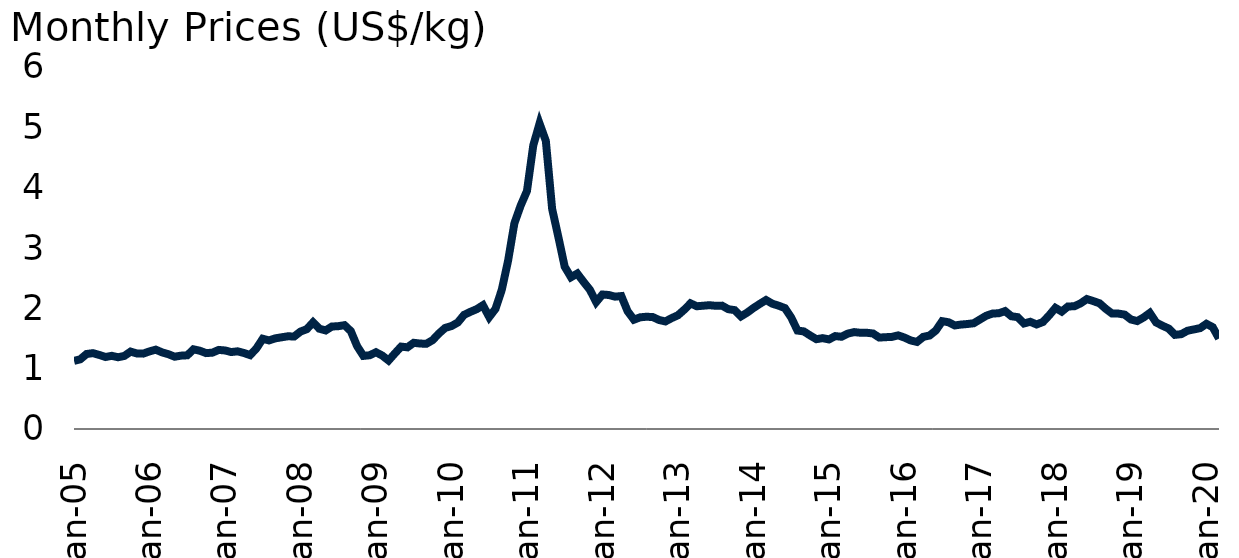
| Category | Cotton |
|---|---|
| 2005-01-01 | 1.13 |
| 2005-02-01 | 1.156 |
| 2005-03-01 | 1.243 |
| 2005-04-01 | 1.257 |
| 2005-05-01 | 1.228 |
| 2005-06-01 | 1.193 |
| 2005-07-01 | 1.213 |
| 2005-08-01 | 1.189 |
| 2005-09-01 | 1.211 |
| 2005-10-01 | 1.283 |
| 2005-11-01 | 1.252 |
| 2005-12-01 | 1.249 |
| 2006-01-01 | 1.286 |
| 2006-02-01 | 1.315 |
| 2006-03-01 | 1.27 |
| 2006-04-01 | 1.24 |
| 2006-05-01 | 1.198 |
| 2006-06-01 | 1.216 |
| 2006-07-01 | 1.221 |
| 2006-08-01 | 1.321 |
| 2006-09-01 | 1.297 |
| 2006-10-01 | 1.258 |
| 2006-11-01 | 1.265 |
| 2006-12-01 | 1.311 |
| 2007-01-01 | 1.302 |
| 2007-02-01 | 1.275 |
| 2007-03-01 | 1.287 |
| 2007-04-01 | 1.26 |
| 2007-05-01 | 1.225 |
| 2007-06-01 | 1.336 |
| 2007-07-01 | 1.496 |
| 2007-08-01 | 1.468 |
| 2007-09-01 | 1.502 |
| 2007-10-01 | 1.52 |
| 2007-11-01 | 1.537 |
| 2007-12-01 | 1.533 |
| 2008-01-01 | 1.615 |
| 2008-02-01 | 1.655 |
| 2008-03-01 | 1.768 |
| 2008-04-01 | 1.662 |
| 2008-05-01 | 1.634 |
| 2008-06-01 | 1.699 |
| 2008-07-01 | 1.704 |
| 2008-08-01 | 1.721 |
| 2008-09-01 | 1.623 |
| 2008-10-01 | 1.373 |
| 2008-11-01 | 1.211 |
| 2008-12-01 | 1.222 |
| 2009-01-01 | 1.272 |
| 2009-02-01 | 1.217 |
| 2009-03-01 | 1.135 |
| 2009-04-01 | 1.252 |
| 2009-05-01 | 1.366 |
| 2009-06-01 | 1.354 |
| 2009-07-01 | 1.429 |
| 2009-08-01 | 1.416 |
| 2009-09-01 | 1.412 |
| 2009-10-01 | 1.473 |
| 2009-11-01 | 1.583 |
| 2009-12-01 | 1.676 |
| 2010-01-01 | 1.706 |
| 2010-02-01 | 1.765 |
| 2010-03-01 | 1.892 |
| 2010-04-01 | 1.942 |
| 2010-05-01 | 1.986 |
| 2010-06-01 | 2.051 |
| 2010-07-01 | 1.855 |
| 2010-08-01 | 1.992 |
| 2010-09-01 | 2.309 |
| 2010-10-01 | 2.79 |
| 2010-11-01 | 3.41 |
| 2010-12-01 | 3.703 |
| 2011-01-01 | 3.945 |
| 2011-02-01 | 4.7 |
| 2011-03-01 | 5.063 |
| 2011-04-01 | 4.776 |
| 2011-05-01 | 3.649 |
| 2011-06-01 | 3.178 |
| 2011-07-01 | 2.69 |
| 2011-08-01 | 2.515 |
| 2011-09-01 | 2.576 |
| 2011-10-01 | 2.439 |
| 2011-11-01 | 2.308 |
| 2011-12-01 | 2.104 |
| 2012-01-01 | 2.229 |
| 2012-02-01 | 2.221 |
| 2012-03-01 | 2.194 |
| 2012-04-01 | 2.203 |
| 2012-05-01 | 1.952 |
| 2012-06-01 | 1.812 |
| 2012-07-01 | 1.851 |
| 2012-08-01 | 1.861 |
| 2012-09-01 | 1.855 |
| 2012-10-01 | 1.807 |
| 2012-11-01 | 1.783 |
| 2012-12-01 | 1.838 |
| 2013-01-01 | 1.885 |
| 2013-02-01 | 1.978 |
| 2013-03-01 | 2.082 |
| 2013-04-01 | 2.034 |
| 2013-05-01 | 2.043 |
| 2013-06-01 | 2.052 |
| 2013-07-01 | 2.042 |
| 2013-08-01 | 2.045 |
| 2013-09-01 | 1.986 |
| 2013-10-01 | 1.97 |
| 2013-11-01 | 1.866 |
| 2013-12-01 | 1.929 |
| 2014-01-01 | 2.005 |
| 2014-02-01 | 2.073 |
| 2014-03-01 | 2.137 |
| 2014-04-01 | 2.077 |
| 2014-05-01 | 2.044 |
| 2014-06-01 | 2.004 |
| 2014-07-01 | 1.848 |
| 2014-08-01 | 1.631 |
| 2014-09-01 | 1.618 |
| 2014-10-01 | 1.551 |
| 2014-11-01 | 1.489 |
| 2014-12-01 | 1.506 |
| 2015-01-01 | 1.485 |
| 2015-02-01 | 1.54 |
| 2015-03-01 | 1.529 |
| 2015-04-01 | 1.581 |
| 2015-05-01 | 1.606 |
| 2015-06-01 | 1.595 |
| 2015-07-01 | 1.595 |
| 2015-08-01 | 1.583 |
| 2015-09-01 | 1.515 |
| 2015-10-01 | 1.522 |
| 2015-11-01 | 1.526 |
| 2015-12-01 | 1.552 |
| 2016-01-01 | 1.516 |
| 2016-02-01 | 1.468 |
| 2016-03-01 | 1.443 |
| 2016-04-01 | 1.527 |
| 2016-05-01 | 1.549 |
| 2016-06-01 | 1.634 |
| 2016-07-01 | 1.787 |
| 2016-08-01 | 1.769 |
| 2016-09-01 | 1.717 |
| 2016-10-01 | 1.731 |
| 2016-11-01 | 1.74 |
| 2016-12-01 | 1.753 |
| 2017-01-01 | 1.815 |
| 2017-02-01 | 1.877 |
| 2017-03-01 | 1.913 |
| 2017-04-01 | 1.919 |
| 2017-05-01 | 1.954 |
| 2017-06-01 | 1.869 |
| 2017-07-01 | 1.854 |
| 2017-08-01 | 1.749 |
| 2017-09-01 | 1.777 |
| 2017-10-01 | 1.733 |
| 2017-11-01 | 1.773 |
| 2017-12-01 | 1.883 |
| 2018-01-01 | 2.008 |
| 2018-02-01 | 1.946 |
| 2018-03-01 | 2.031 |
| 2018-04-01 | 2.034 |
| 2018-05-01 | 2.083 |
| 2018-06-01 | 2.154 |
| 2018-07-01 | 2.12 |
| 2018-08-01 | 2.084 |
| 2018-09-01 | 1.992 |
| 2018-10-01 | 1.914 |
| 2018-11-01 | 1.913 |
| 2018-12-01 | 1.896 |
| 2019-01-01 | 1.816 |
| 2019-02-01 | 1.789 |
| 2019-03-01 | 1.848 |
| 2019-04-01 | 1.924 |
| 2019-05-01 | 1.767 |
| 2019-06-01 | 1.712 |
| 2019-07-01 | 1.665 |
| 2019-08-01 | 1.56 |
| 2019-09-01 | 1.572 |
| 2019-10-01 | 1.629 |
| 2019-11-01 | 1.65 |
| 2019-12-01 | 1.672 |
| 2020-01-01 | 1.743 |
| 2020-02-01 | 1.688 |
| 2020-03-01 | 1.499 |